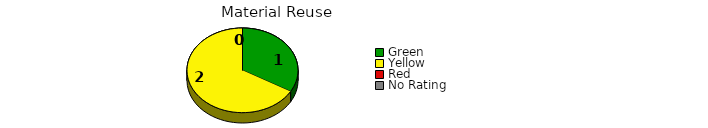
| Category | Counts |
|---|---|
| Green | 1 |
| Yellow | 2 |
| Red | 0 |
| No Rating | 0 |